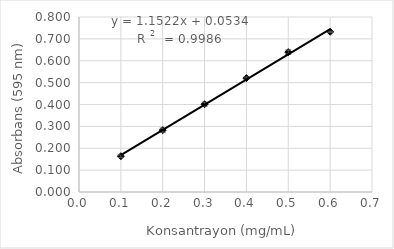
| Category | Series 0 |
|---|---|
| 0.1 | 0.164 |
| 0.2 | 0.283 |
| 0.3 | 0.401 |
| 0.4 | 0.521 |
| 0.5 | 0.639 |
| 0.6 | 0.732 |